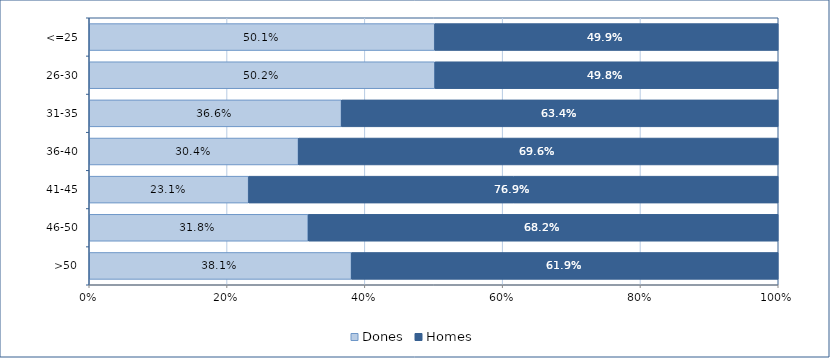
| Category | Dones | Homes |
|---|---|---|
| >50 | 0.381 | 0.619 |
| 46-50 | 0.318 | 0.682 |
| 41-45 | 0.231 | 0.769 |
| 36-40 | 0.304 | 0.696 |
| 31-35 | 0.366 | 0.634 |
| 26-30 | 0.502 | 0.498 |
| <=25 | 0.501 | 0.499 |